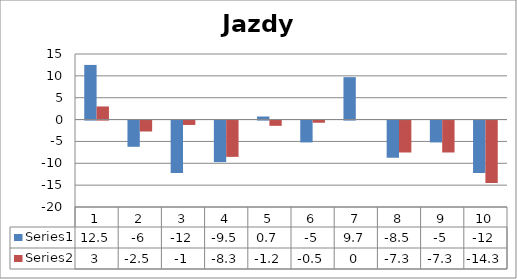
| Category | Series 0 | Series 1 |
|---|---|---|
| 0 | 12.5 | 3 |
| 1 | -6 | -2.5 |
| 2 | -12 | -1 |
| 3 | -9.5 | -8.3 |
| 4 | 0.7 | -1.2 |
| 5 | -5 | -0.5 |
| 6 | 9.7 | 0 |
| 7 | -8.5 | -7.3 |
| 8 | -5 | -7.3 |
| 9 | -12 | -14.3 |